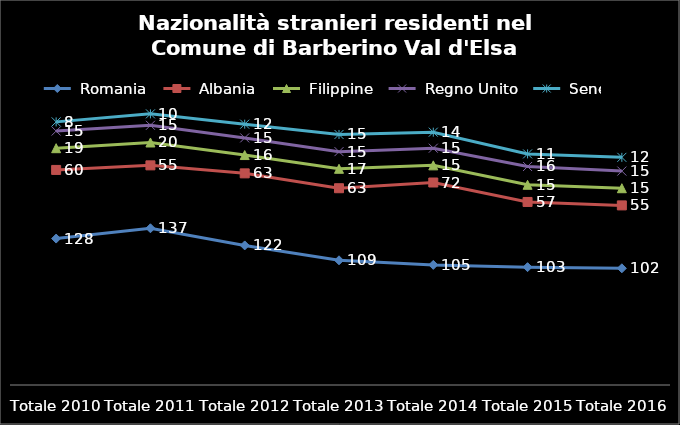
| Category |  Romania  |  Albania  |  Filippine  |  Regno Unito  |  Senegal  |
|---|---|---|---|---|---|
| Totale 2016 | 102 | 55 | 15 | 15 | 12 |
| Totale 2015 | 103 | 57 | 15 | 16 | 11 |
| Totale 2014 | 105 | 72 | 15 | 15 | 14 |
| Totale 2013 | 109 | 63 | 17 | 15 | 15 |
| Totale 2012 | 122 | 63 | 16 | 15 | 12 |
| Totale 2011 | 137 | 55 | 20 | 15 | 10 |
| Totale 2010 | 128 | 60 | 19 | 15 | 8 |